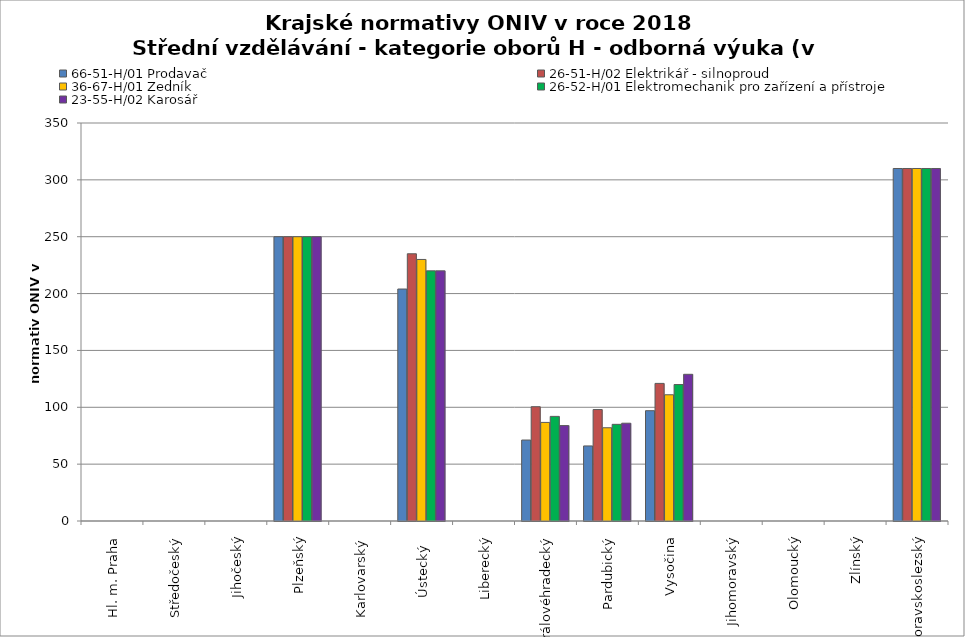
| Category | 66-51-H/01 Prodavač | 26-51-H/02 Elektrikář - silnoproud | 36-67-H/01 Zedník | 26-52-H/01 Elektromechanik pro zařízení a přístroje | 23-55-H/02 Karosář |
|---|---|---|---|---|---|
| Hl. m. Praha | 0 | 0 | 0 | 0 | 0 |
| Středočeský | 0 | 0 | 0 | 0 | 0 |
| Jihočeský | 0 | 0 | 0 | 0 | 0 |
| Plzeňský | 250 | 250 | 250 | 250 | 250 |
| Karlovarský  | 0 | 0 | 0 | 0 | 0 |
| Ústecký   | 204 | 235 | 230 | 220 | 220 |
| Liberecký | 0 | 0 | 0 | 0 | 0 |
| Královéhradecký | 71.2 | 100.5 | 86.7 | 92 | 83.9 |
| Pardubický | 66 | 98 | 82 | 85 | 86 |
| Vysočina | 97 | 121 | 111 | 120 | 129 |
| Jihomoravský | 0 | 0 | 0 | 0 | 0 |
| Olomoucký | 0 | 0 | 0 | 0 | 0 |
| Zlínský | 0 | 0 | 0 | 0 | 0 |
| Moravskoslezský | 310 | 310 | 310 | 310 | 310 |